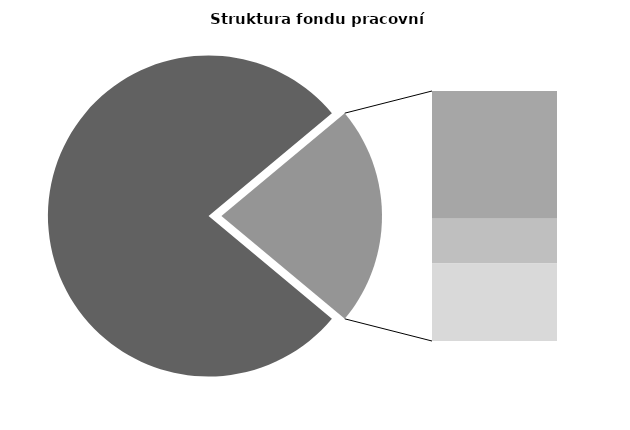
| Category | Series 0 |
|---|---|
| Průměrná měsíční odpracovaná doba bez přesčasu | 134.939 |
| Dovolená | 19.576 |
| Nemoc | 6.887 |
| Jiné | 11.875 |